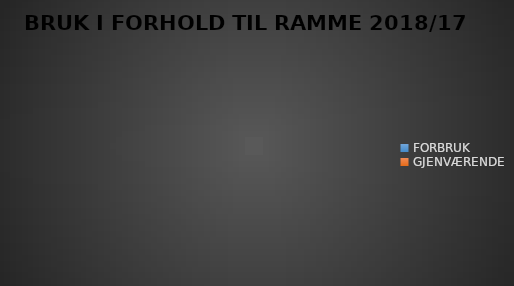
| Category | BRUK I FORHOLD TIL RAMME 2018/17 |
|---|---|
| FORBRUK | 0 |
| GJENVÆRENDE | 0 |